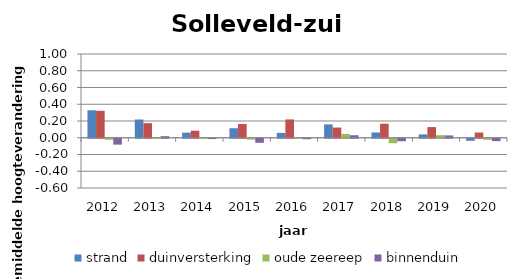
| Category | strand | duinversterking | oude zeereep | binnenduin |
|---|---|---|---|---|
| 2012.0 | 0.327 | 0.322 | -0.012 | -0.07 |
| 2013.0 | 0.218 | 0.174 | 0.001 | 0.019 |
| 2014.0 | 0.061 | 0.084 | 0.005 | -0.004 |
| 2015.0 | 0.114 | 0.165 | -0.011 | -0.048 |
| 2016.0 | 0.058 | 0.219 | 0 | -0.006 |
| 2017.0 | 0.159 | 0.122 | 0.045 | 0.03 |
| 2018.0 | 0.063 | 0.168 | -0.053 | -0.029 |
| 2019.0 | 0.04 | 0.128 | 0.03 | 0.028 |
| 2020.0 | -0.024 | 0.063 | -0.012 | -0.028 |